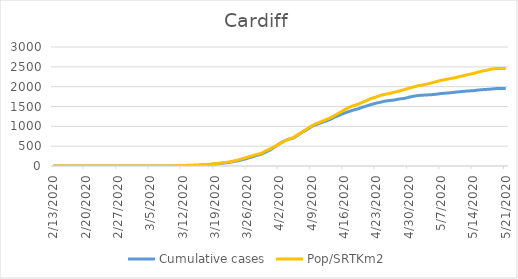
| Category | Cumulative cases | Pop/SRTKm2 |
|---|---|---|
| 5/21/20 | 1953 | 2458.952 |
| 5/20/20 | 1953 | 2458.952 |
| 5/19/20 | 1953 | 2458.374 |
| 5/18/20 | 1941 | 2444.896 |
| 5/17/20 | 1932 | 2416.207 |
| 5/16/20 | 1925 | 2394.835 |
| 5/15/20 | 1915 | 2364.799 |
| 5/14/20 | 1899 | 2331.489 |
| 5/13/20 | 1892 | 2308.384 |
| 5/12/20 | 1884 | 2281.813 |
| 5/11/20 | 1871 | 2255.435 |
| 5/10/20 | 1860 | 2222.703 |
| 5/9/20 | 1846 | 2203.641 |
| 5/8/20 | 1836 | 2179.766 |
| 5/7/20 | 1827 | 2160.512 |
| 5/6/20 | 1810 | 2128.742 |
| 5/5/20 | 1799 | 2096.973 |
| 5/4/20 | 1792 | 2066.359 |
| 5/3/20 | 1785 | 2041.714 |
| 5/2/20 | 1777 | 2023.615 |
| 5/1/20 | 1758 | 1991.46 |
| 4/30/20 | 1733 | 1961.039 |
| 4/29/20 | 1702 | 1924.071 |
| 4/28/20 | 1691 | 1892.686 |
| 4/27/20 | 1666 | 1864.575 |
| 4/26/20 | 1652 | 1832.998 |
| 4/25/20 | 1638 | 1810.086 |
| 4/24/20 | 1611 | 1784.093 |
| 4/23/20 | 1586 | 1744.236 |
| 4/22/20 | 1555 | 1706.113 |
| 4/21/20 | 1518 | 1657.785 |
| 4/20/20 | 1483 | 1609.072 |
| 4/19/20 | 1439 | 1556.123 |
| 4/18/20 | 1409 | 1521.851 |
| 4/17/20 | 1372 | 1475.063 |
| 4/16/20 | 1331 | 1413.064 |
| 4/15/20 | 1281 | 1343.942 |
| 4/14/20 | 1236 | 1275.59 |
| 4/13/20 | 1176 | 1215.902 |
| 4/12/20 | 1130 | 1164.493 |
| 4/11/20 | 1090 | 1117.705 |
| 4/10/20 | 1046 | 1070.725 |
| 4/9/20 | 999 | 1012.963 |
| 4/8/20 | 920 | 937.871 |
| 4/7/20 | 856 | 864.128 |
| 4/6/20 | 781 | 791.732 |
| 4/5/20 | 704 | 718.759 |
| 4/4/20 | 675 | 676.207 |
| 4/3/20 | 629 | 622.103 |
| 4/2/20 | 565 | 559.719 |
| 4/1/20 | 481 | 495.603 |
| 3/31/20 | 409 | 433.989 |
| 3/30/20 | 350 | 381.81 |
| 3/29/20 | 295 | 317.501 |
| 3/28/20 | 266 | 287.465 |
| 3/27/20 | 227 | 255.503 |
| 3/26/20 | 194 | 219.883 |
| 3/25/20 | 159 | 186.38 |
| 3/24/20 | 130 | 151.145 |
| 3/23/20 | 111 | 125.152 |
| 3/22/20 | 86 | 100.122 |
| 3/21/20 | 75 | 85.489 |
| 3/20/20 | 62 | 71.048 |
| 3/19/20 | 51 | 57.185 |
| 3/18/20 | 36 | 45.632 |
| 3/17/20 | 29 | 38.893 |
| 3/16/20 | 18 | 31.769 |
| 3/15/20 | 14 | 25.223 |
| 3/14/20 | 8 | 19.639 |
| 3/13/20 | 4 | 15.981 |
| 3/12/20 | 4 | 10.782 |
| 3/11/20 | 3 | 6.161 |
| 3/10/20 | 2 | 3.466 |
| 3/9/20 | 2 | 1.348 |
| 3/8/20 | 1 | 0.77 |
| 3/7/20 | 1 | 0.77 |
| 3/6/20 | 1 | 0.385 |
| 3/5/20 | 1 | 0.385 |
| 3/4/20 | 1 | 0.385 |
| 3/3/20 | 0 | 0.193 |
| 3/2/20 | 0 | 0.193 |
| 3/1/20 | 0 | 0.193 |
| 2/29/20 | 0 | 0.193 |
| 2/28/20 | 0 | 0.193 |
| 2/27/20 | 0 | 0.193 |
| 2/26/20 | 0 | 0 |
| 2/25/20 | 0 | 0 |
| 2/24/20 | 0 | 0 |
| 2/23/20 | 0 | 0 |
| 2/22/20 | 0 | 0 |
| 2/21/20 | 0 | 0 |
| 2/20/20 | 0 | 0 |
| 2/19/20 | 0 | 0 |
| 2/18/20 | 0 | 0 |
| 2/17/20 | 0 | 0 |
| 2/16/20 | 0 | 0 |
| 2/15/20 | 0 | 0 |
| 2/14/20 | 0 | 0 |
| 2/13/20 | 0 | 0 |